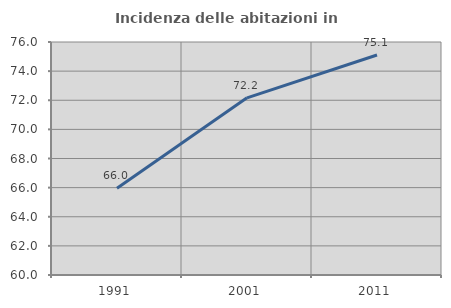
| Category | Incidenza delle abitazioni in proprietà  |
|---|---|
| 1991.0 | 65.953 |
| 2001.0 | 72.168 |
| 2011.0 | 75.111 |